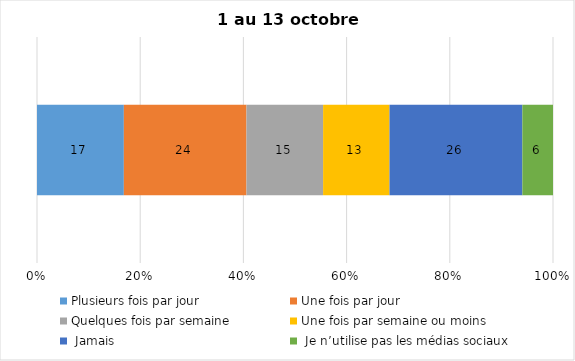
| Category | Plusieurs fois par jour | Une fois par jour | Quelques fois par semaine   | Une fois par semaine ou moins   |  Jamais   |  Je n’utilise pas les médias sociaux |
|---|---|---|---|---|---|---|
| 0 | 17 | 24 | 15 | 13 | 26 | 6 |